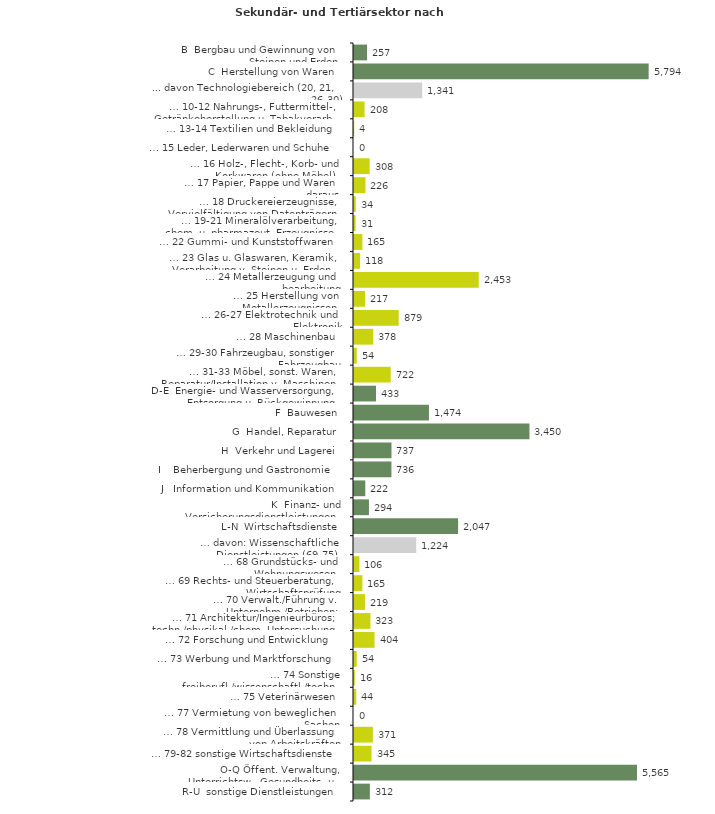
| Category | Series 0 |
|---|---|
| B  Bergbau und Gewinnung von Steinen und Erden | 257 |
| C  Herstellung von Waren | 5794 |
| ... davon Technologiebereich (20, 21, 26-30) | 1341 |
| … 10-12 Nahrungs-, Futtermittel-, Getränkeherstellung u. Tabakverarb. | 208 |
| … 13-14 Textilien und Bekleidung | 4 |
| … 15 Leder, Lederwaren und Schuhe | 0 |
| … 16 Holz-, Flecht-, Korb- und Korkwaren (ohne Möbel)  | 308 |
| … 17 Papier, Pappe und Waren daraus  | 226 |
| … 18 Druckereierzeugnisse, Vervielfältigung von Datenträgern | 34 |
| … 19-21 Mineralölverarbeitung, chem. u. pharmazeut. Erzeugnisse | 31 |
| … 22 Gummi- und Kunststoffwaren | 165 |
| … 23 Glas u. Glaswaren, Keramik, Verarbeitung v. Steinen u. Erden  | 118 |
| … 24 Metallerzeugung und -bearbeitung | 2453 |
| … 25 Herstellung von Metallerzeugnissen  | 217 |
| … 26-27 Elektrotechnik und Elektronik | 879 |
| … 28 Maschinenbau | 378 |
| … 29-30 Fahrzeugbau, sonstiger Fahrzeugbau | 54 |
| … 31-33 Möbel, sonst. Waren, Reparatur/Installation v. Maschinen | 722 |
| D-E  Energie- und Wasserversorgung, Entsorgung u. Rückgewinnung | 433 |
| F  Bauwesen | 1474 |
| G  Handel, Reparatur | 3450 |
| H  Verkehr und Lagerei | 737 |
| I    Beherbergung und Gastronomie | 736 |
| J   Information und Kommunikation | 222 |
| K  Finanz- und Versicherungsdienstleistungen | 294 |
| L-N  Wirtschaftsdienste | 2047 |
| … davon: Wissenschaftliche Dienstleistungen (69-75) | 1224 |
| … 68 Grundstücks- und Wohnungswesen  | 106 |
| … 69 Rechts- und Steuerberatung, Wirtschaftsprüfung | 165 |
| … 70 Verwalt./Führung v. Unternehm./Betrieben; Unternehmensberat. | 219 |
| … 71 Architektur/Ingenieurbüros; techn./physikal./chem. Untersuchung | 323 |
| … 72 Forschung und Entwicklung  | 404 |
| … 73 Werbung und Marktforschung | 54 |
| … 74 Sonstige freiberufl./wissenschaftl./techn. Tätigkeiten | 16 |
| … 75 Veterinärwesen | 44 |
| … 77 Vermietung von beweglichen Sachen  | 0 |
| … 78 Vermittlung und Überlassung von Arbeitskräften | 371 |
| … 79-82 sonstige Wirtschaftsdienste | 345 |
| O-Q Öffent. Verwaltung, Unterrichtsw., Gesundheits- u. Sozialwesen | 5565 |
| R-U  sonstige Dienstleistungen | 312 |